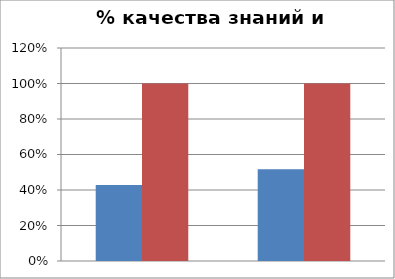
| Category | Series 0 | 2 |
|---|---|---|
| Хакунова Ж.М. | 0.429 | 1 |
| Губжокова Р.Х. | 0.517 | 1 |